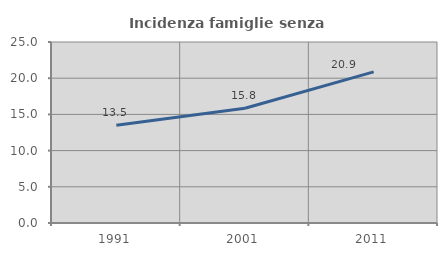
| Category | Incidenza famiglie senza nuclei |
|---|---|
| 1991.0 | 13.504 |
| 2001.0 | 15.842 |
| 2011.0 | 20.87 |